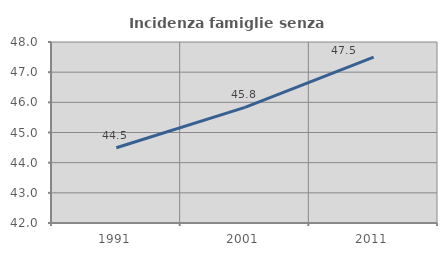
| Category | Incidenza famiglie senza nuclei |
|---|---|
| 1991.0 | 44.495 |
| 2001.0 | 45.833 |
| 2011.0 | 47.5 |